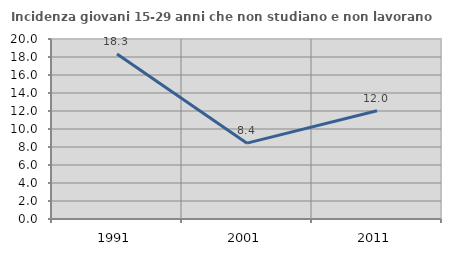
| Category | Incidenza giovani 15-29 anni che non studiano e non lavorano  |
|---|---|
| 1991.0 | 18.333 |
| 2001.0 | 8.427 |
| 2011.0 | 12.031 |